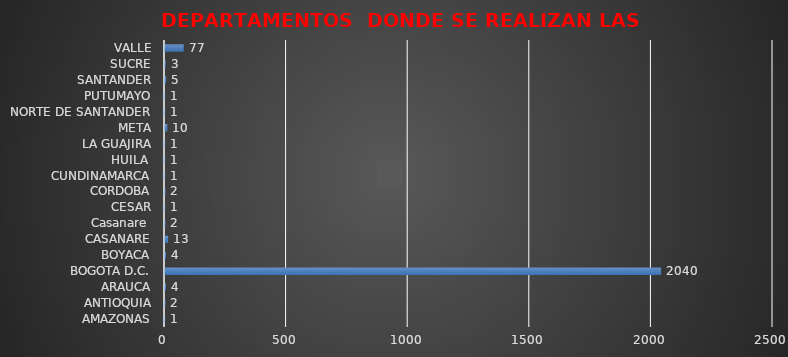
| Category | DEPARTAMENTOS DE CONSULTA 2020 |
|---|---|
| AMAZONAS | 1 |
| ANTIOQUIA | 2 |
| ARAUCA | 4 |
| BOGOTA D.C. | 2040 |
| BOYACA | 4 |
| CASANARE | 13 |
| Casanare  | 2 |
| CESAR | 1 |
| CORDOBA | 2 |
| CUNDINAMARCA | 1 |
| HUILA  | 1 |
| LA GUAJIRA | 1 |
| META | 10 |
| NORTE DE SANTANDER | 1 |
| PUTUMAYO | 1 |
| SANTANDER | 5 |
| SUCRE | 3 |
| VALLE | 77 |